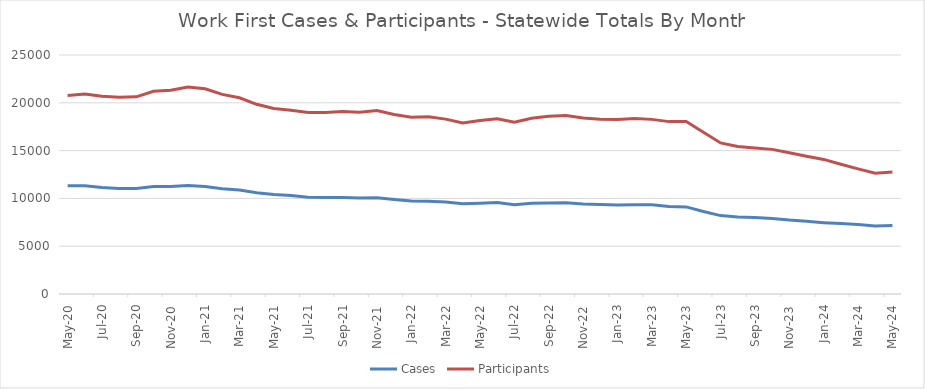
| Category | Cases | Participants |
|---|---|---|
| 2024-05-24 | 7158 | 12769 |
| 2024-04-24 | 7110 | 12638 |
| 2024-03-24 | 7277 | 13089 |
| 2024-02-24 | 7368 | 13574 |
| 2024-01-24 | 7465 | 14077 |
| 2023-12-23 | 7598 | 14413 |
| 2023-11-23 | 7733 | 14770 |
| 2023-10-23 | 7909 | 15129 |
| 2023-09-23 | 7993 | 15261 |
| 2023-08-23 | 8048 | 15431 |
| 2023-07-23 | 8201 | 15804 |
| 2023-06-23 | 8626 | 16926 |
| 2023-05-23 | 9109 | 18037 |
| 2023-04-23 | 9158 | 18032 |
| 2023-03-23 | 9330 | 18266 |
| 2023-02-01 | 9348 | 18367 |
| 2023-01-01 | 9307 | 18258 |
| 2022-12-01 | 9357 | 18283 |
| 2022-11-22 | 9423 | 18412 |
| 2022-10-22 | 9547 | 18673 |
| 2022-09-22 | 9528 | 18586 |
| 2022-08-22 | 9505 | 18379 |
| 2022-07-22 | 9349 | 17973 |
| 2022-06-22 | 9561 | 18334 |
| 2022-05-22 | 9493 | 18139 |
| 2022-04-22 | 9434 | 17898 |
| 2022-03-22 | 9625 | 18293 |
| 2022-02-22 | 9713 | 18537 |
| 2022-01-22 | 9733 | 18484 |
| 2021-12-21 | 9885 | 18776 |
| 2021-11-21 | 10056 | 19192 |
| 2021-10-21 | 10034 | 19005 |
| 2021-09-21 | 10102 | 19085 |
| 2021-08-21 | 10090 | 18974 |
| 2021-07-21 | 10121 | 18988 |
| 2021-06-21 | 10298 | 19211 |
| 2021-05-21 | 10411 | 19413 |
| 2021-04-21 | 10601 | 19845 |
| 2021-03-21 | 10888 | 20521 |
| 2021-02-21 | 11007 | 20877 |
| 2021-01-21 | 11252 | 21466 |
| 2020-12-20 | 11350 | 21641 |
| 2020-11-20 | 11255 | 21305 |
| 2020-10-20 | 11243 | 21198 |
| 2020-09-20 | 11030 | 20626 |
| 2020-08-20 | 11034 | 20575 |
| 2020-07-20 | 11137 | 20693 |
| 2020-06-20 | 11320 | 20921 |
| 2020-05-20 | 11330 | 20766 |